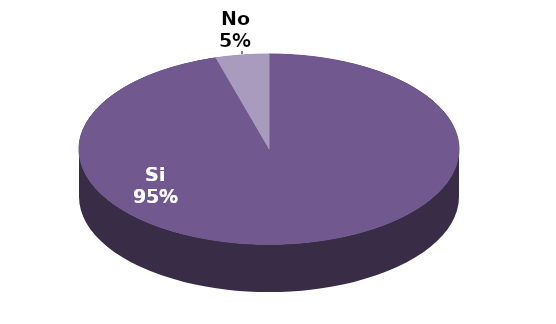
| Category | Series 1 |
|---|---|
| Si | 21 |
| No | 1 |